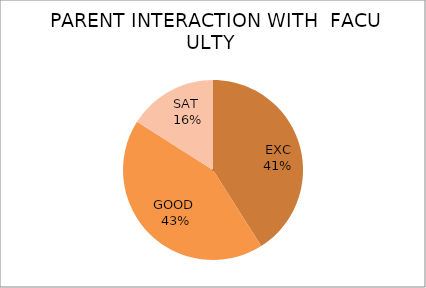
| Category | Series 0 |
|---|---|
| EXC | 41 |
| GOOD  | 43 |
| SAT  | 16 |